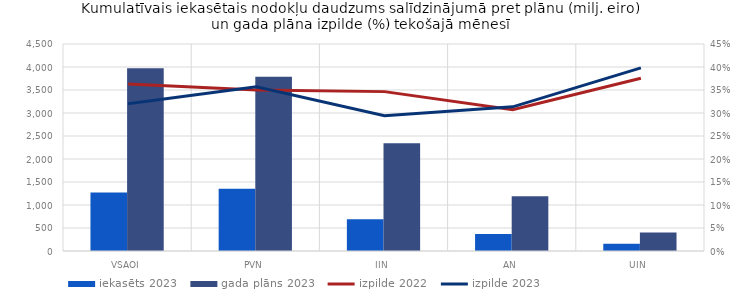
| Category | iekasēts 2023 | gada plāns 2023 |
|---|---|---|
| VSAOI | 1272.911 | 3975.521 |
| PVN | 1351.847 | 3786.234 |
| IIN | 689.637 | 2344 |
| AN | 372.24 | 1187.7 |
| UIN | 159.998 | 402 |